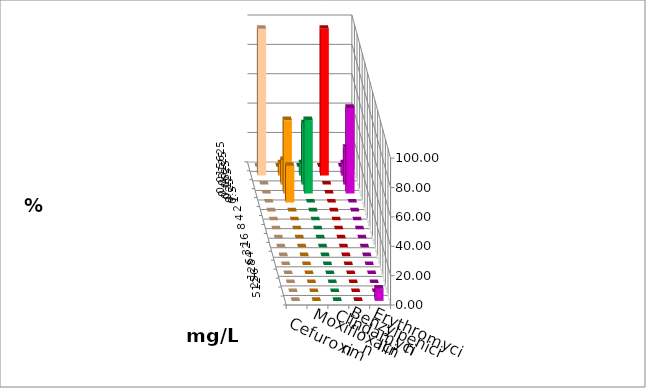
| Category | Cefuroxim | Moxifloxacin | Clindamycin | Benzylpenicillin | Erythromycin |
|---|---|---|---|---|---|
| 0.015625 | 0 | 0 | 0 | 0 | 0 |
| 0.03125 | 100 | 8.333 | 8.333 | 100 | 8.333 |
| 0.0625 | 0 | 16.667 | 41.667 | 0 | 25 |
| 0.125 | 0 | 50 | 50 | 0 | 58.333 |
| 0.25 | 0 | 25 | 0 | 0 | 0 |
| 0.5 | 0 | 0 | 0 | 0 | 0 |
| 1.0 | 0 | 0 | 0 | 0 | 0 |
| 2.0 | 0 | 0 | 0 | 0 | 0 |
| 4.0 | 0 | 0 | 0 | 0 | 0 |
| 8.0 | 0 | 0 | 0 | 0 | 0 |
| 16.0 | 0 | 0 | 0 | 0 | 0 |
| 32.0 | 0 | 0 | 0 | 0 | 0 |
| 64.0 | 0 | 0 | 0 | 0 | 0 |
| 128.0 | 0 | 0 | 0 | 0 | 0 |
| 256.0 | 0 | 0 | 0 | 0 | 0 |
| 512.0 | 0 | 0 | 0 | 0 | 8.333 |